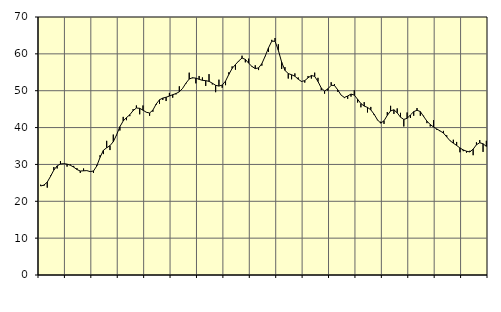
| Category | Piggar | Series 1 |
|---|---|---|
| nan | 24.5 | 24.15 |
| 87.0 | 24.2 | 24.41 |
| 87.0 | 23.7 | 25.2 |
| 87.0 | 27 | 26.77 |
| nan | 29.3 | 28.47 |
| 88.0 | 28.9 | 29.61 |
| 88.0 | 30.9 | 30.12 |
| 88.0 | 30.2 | 30.22 |
| nan | 29.4 | 30.08 |
| 89.0 | 30 | 29.78 |
| 89.0 | 29.6 | 29.28 |
| 89.0 | 29 | 28.62 |
| nan | 27.7 | 28.21 |
| 90.0 | 28.9 | 28.27 |
| 90.0 | 28.3 | 28.32 |
| 90.0 | 28.1 | 28.05 |
| nan | 27.7 | 28.22 |
| 91.0 | 29.8 | 29.57 |
| 91.0 | 32.5 | 31.93 |
| 91.0 | 32.8 | 33.83 |
| nan | 36.4 | 34.52 |
| 92.0 | 33.9 | 35.09 |
| 92.0 | 38.1 | 36.17 |
| 92.0 | 37.9 | 38.03 |
| nan | 39.2 | 40.23 |
| 93.0 | 42.9 | 41.79 |
| 93.0 | 42 | 42.71 |
| 93.0 | 43.1 | 43.48 |
| nan | 45 | 44.59 |
| 94.0 | 46 | 45.31 |
| 94.0 | 43.6 | 45.22 |
| 94.0 | 46 | 44.72 |
| nan | 44.2 | 44.16 |
| 95.0 | 43.2 | 43.96 |
| 95.0 | 44.3 | 44.74 |
| 95.0 | 46.2 | 46.39 |
| nan | 46.4 | 47.55 |
| 96.0 | 47.5 | 48 |
| 96.0 | 47.2 | 48.23 |
| 96.0 | 49.4 | 48.56 |
| nan | 48.1 | 48.92 |
| 97.0 | 49 | 49.23 |
| 97.0 | 51.2 | 49.7 |
| 97.0 | 50.6 | 50.64 |
| nan | 51.9 | 52.04 |
| 98.0 | 54.9 | 53.17 |
| 98.0 | 53.4 | 53.52 |
| 98.0 | 52 | 53.41 |
| nan | 54 | 53.09 |
| 99.0 | 53.6 | 52.82 |
| 99.0 | 51.3 | 52.73 |
| 99.0 | 54.5 | 52.54 |
| nan | 51.7 | 52.04 |
| 0.0 | 49.6 | 51.47 |
| 0.0 | 53 | 51.26 |
| 0.0 | 50.8 | 51.53 |
| nan | 51.5 | 52.61 |
| 1.0 | 55 | 54.43 |
| 1.0 | 56.6 | 56.04 |
| 1.0 | 55.7 | 57.09 |
| nan | 58 | 58.08 |
| 2.0 | 59.5 | 58.87 |
| 2.0 | 57.7 | 58.5 |
| 2.0 | 58.7 | 57.47 |
| nan | 56.7 | 56.59 |
| 3.0 | 56.9 | 56 |
| 3.0 | 55.6 | 56.19 |
| 3.0 | 56.8 | 57.35 |
| nan | 59.4 | 59.34 |
| 4.0 | 60.5 | 61.59 |
| 4.0 | 63.8 | 63.43 |
| 4.0 | 64.3 | 63.42 |
| nan | 62.6 | 60.95 |
| 5.0 | 55.9 | 57.74 |
| 5.0 | 56.4 | 55.51 |
| 5.0 | 53.3 | 54.66 |
| nan | 53.1 | 54.33 |
| 6.0 | 54.7 | 53.93 |
| 6.0 | 53.6 | 53.13 |
| 6.0 | 52.6 | 52.51 |
| nan | 52.2 | 52.74 |
| 7.0 | 54 | 53.5 |
| 7.0 | 53.3 | 54.13 |
| 7.0 | 54.9 | 53.89 |
| nan | 53.5 | 52.51 |
| 8.0 | 50.2 | 50.72 |
| 8.0 | 49.2 | 49.91 |
| 8.0 | 50 | 50.51 |
| nan | 52.3 | 51.46 |
| 9.0 | 51.8 | 51.42 |
| 9.0 | 49.7 | 50.22 |
| 9.0 | 48.8 | 48.81 |
| nan | 48 | 48.17 |
| 10.0 | 47.8 | 48.56 |
| 10.0 | 48.4 | 49.1 |
| 10.0 | 50.1 | 48.8 |
| nan | 46.8 | 47.68 |
| 11.0 | 45.5 | 46.52 |
| 11.0 | 46.9 | 45.83 |
| 11.0 | 44.1 | 45.47 |
| nan | 45.6 | 44.81 |
| 12.0 | 43.4 | 43.62 |
| 12.0 | 42 | 42.13 |
| 12.0 | 41.6 | 41.2 |
| nan | 41 | 41.84 |
| 13.0 | 44.2 | 43.31 |
| 13.0 | 45.9 | 44.52 |
| 13.0 | 43.7 | 44.83 |
| nan | 45.2 | 44 |
| 14.0 | 44 | 42.81 |
| 14.0 | 40.3 | 42.21 |
| 14.0 | 44.1 | 42.51 |
| nan | 42.6 | 43.42 |
| 15.0 | 43.2 | 44.31 |
| 15.0 | 45.3 | 44.71 |
| 15.0 | 43.2 | 44.34 |
| nan | 43.2 | 43.02 |
| 16.0 | 41.2 | 41.74 |
| 16.0 | 40.3 | 40.83 |
| 16.0 | 42 | 40.16 |
| nan | 39.4 | 39.62 |
| 17.0 | 39 | 39.09 |
| 17.0 | 39.1 | 38.52 |
| 17.0 | 37.9 | 37.46 |
| nan | 36.5 | 36.43 |
| 18.0 | 36.7 | 35.77 |
| 18.0 | 36.1 | 35.15 |
| 18.0 | 33.3 | 34.47 |
| nan | 33.6 | 33.94 |
| 19.0 | 33.2 | 33.58 |
| 19.0 | 33.7 | 33.39 |
| 19.0 | 32.5 | 34.14 |
| nan | 36 | 35.34 |
| 20.0 | 36.6 | 35.89 |
| 20.0 | 33.4 | 35.6 |
| 20.0 | 36.4 | 34.9 |